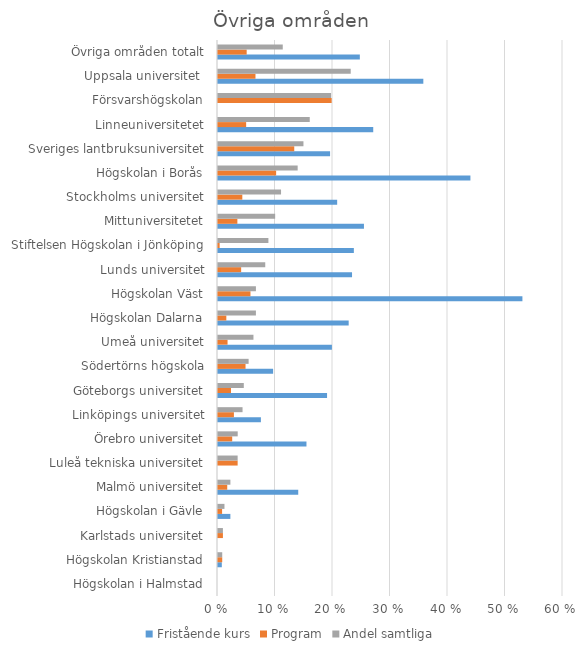
| Category | Fristående kurs | Program | Andel samtliga |
|---|---|---|---|
| Högskolan i Halmstad | 0 | 0 | 0 |
| Högskolan Kristianstad | 0.007 | 0.007 | 0.007 |
| Karlstads universitet | 0 | 0.009 | 0.009 |
| Högskolan i Gävle | 0.022 | 0.007 | 0.011 |
| Malmö universitet | 0.14 | 0.016 | 0.022 |
| Luleå tekniska universitet | 0 | 0.034 | 0.034 |
| Örebro universitet | 0.154 | 0.025 | 0.034 |
| Linköpings universitet | 0.075 | 0.028 | 0.043 |
| Göteborgs universitet | 0.19 | 0.023 | 0.045 |
| Södertörns högskola | 0.096 | 0.048 | 0.053 |
| Umeå universitet | 0.198 | 0.017 | 0.062 |
| Högskolan Dalarna | 0.227 | 0.014 | 0.066 |
| Högskolan Väst | 0.529 | 0.056 | 0.066 |
| Lunds universitet | 0.233 | 0.04 | 0.082 |
| Stiftelsen Högskolan i Jönköping | 0.236 | 0.003 | 0.088 |
| Mittuniversitetet | 0.254 | 0.034 | 0.099 |
| Stockholms universitet | 0.207 | 0.042 | 0.11 |
| Högskolan i Borås | 0.439 | 0.101 | 0.139 |
| Sveriges lantbruksuniversitet | 0.195 | 0.133 | 0.149 |
| Linneuniversitetet | 0.27 | 0.049 | 0.16 |
| Försvarshögskolan | 0 | 0.198 | 0.197 |
| Uppsala universitet  | 0.357 | 0.065 | 0.231 |
| Övriga områden totalt | 0.247 | 0.05 | 0.113 |